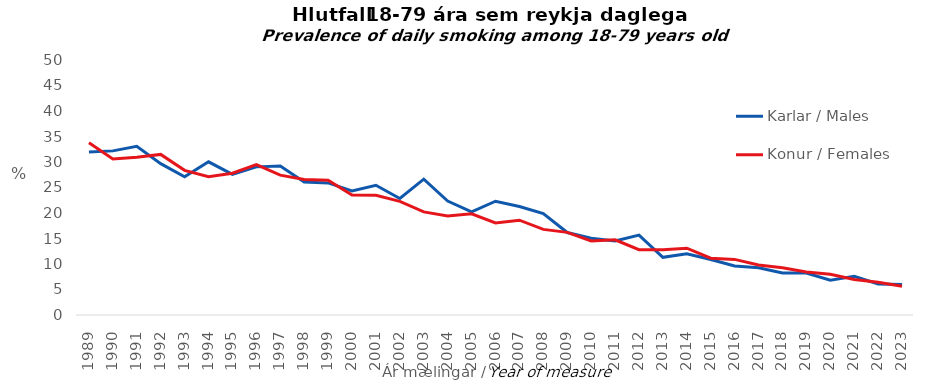
| Category | Karlar / Males | Konur / Females |
|---|---|---|
| 1989.0 | 31.957 | 33.774 |
| 1990.0 | 32.181 | 30.576 |
| 1991.0 | 33.073 | 30.94 |
| 1992.0 | 29.671 | 31.489 |
| 1993.0 | 27.116 | 28.364 |
| 1994.0 | 30.037 | 27.1 |
| 1995.0 | 27.581 | 27.81 |
| 1996.0 | 29.044 | 29.478 |
| 1997.0 | 29.219 | 27.428 |
| 1998.0 | 26.066 | 26.577 |
| 1999.0 | 25.895 | 26.439 |
| 2000.0 | 24.308 | 23.51 |
| 2001.0 | 25.439 | 23.461 |
| 2002.0 | 22.837 | 22.29 |
| 2003.0 | 26.637 | 20.215 |
| 2004.0 | 22.339 | 19.417 |
| 2005.0 | 20.234 | 19.854 |
| 2006.0 | 22.313 | 18.048 |
| 2007.0 | 21.27 | 18.593 |
| 2008.0 | 19.871 | 16.786 |
| 2009.0 | 16.17 | 16.203 |
| 2010.0 | 15.062 | 14.531 |
| 2011.0 | 14.521 | 14.741 |
| 2012.0 | 15.68 | 12.806 |
| 2013.0 | 11.302 | 12.772 |
| 2014.0 | 12 | 13.1 |
| 2015.0 | 10.882 | 11.146 |
| 2016.0 | 9.611 | 10.903 |
| 2017.0 | 9.275 | 9.793 |
| 2018.0 | 8.219 | 9.264 |
| 2019.0 | 8.24 | 8.431 |
| 2020.0 | 6.826 | 8.004 |
| 2021.0 | 7.594 | 6.949 |
| 2022.0 | 6.07 | 6.435 |
| 2023.0 | 5.994 | 5.651 |